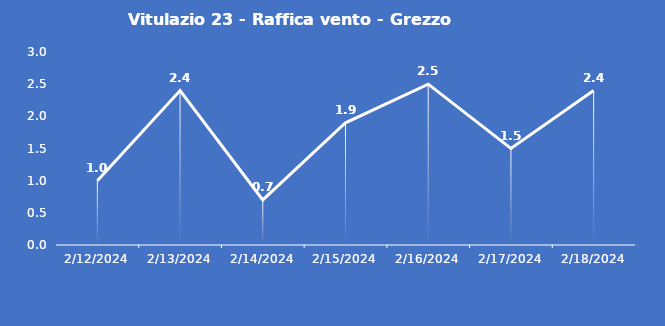
| Category | Vitulazio 23 - Raffica vento - Grezzo (m/s) |
|---|---|
| 2/12/24 | 1 |
| 2/13/24 | 2.4 |
| 2/14/24 | 0.7 |
| 2/15/24 | 1.9 |
| 2/16/24 | 2.5 |
| 2/17/24 | 1.5 |
| 2/18/24 | 2.4 |